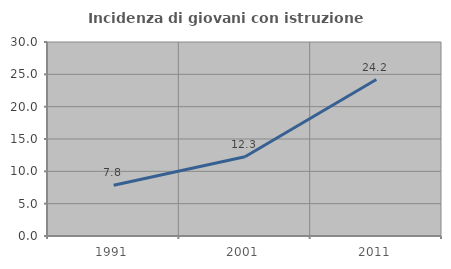
| Category | Incidenza di giovani con istruzione universitaria |
|---|---|
| 1991.0 | 7.843 |
| 2001.0 | 12.264 |
| 2011.0 | 24.194 |